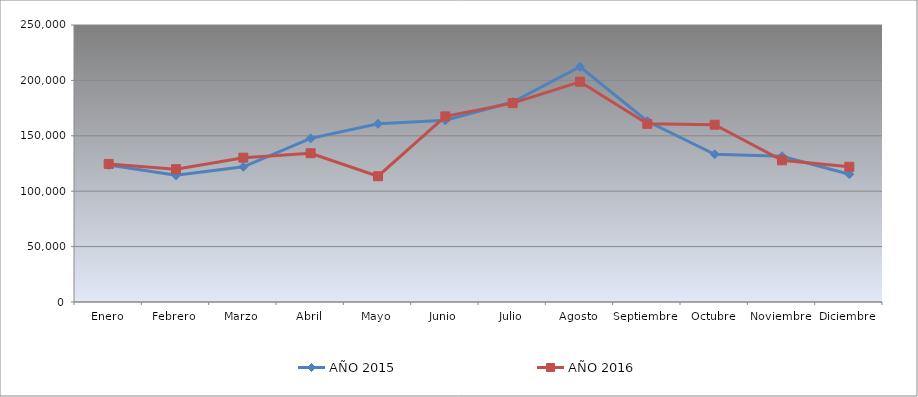
| Category | AÑO 2015 | AÑO 2016 |
|---|---|---|
| Enero | 123680 | 124590 |
| Febrero | 114340 | 119860 |
| Marzo | 122020 | 130270 |
| Abril | 147670 | 134260 |
| Mayo | 160830 | 113510 |
| Junio | 163970 | 167540 |
| Julio | 180510 | 179480 |
| Agosto | 212290 | 198760 |
| Septiembre | 163150 | 160780 |
| Octubre | 133330 | 160000 |
| Noviembre | 131540 | 127900 |
| Diciembre | 115330 | 122020 |